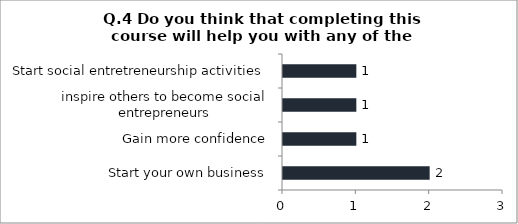
| Category | Q.4 Do you think that completing this course will help you with any of the followoing ? |
|---|---|
| Start your own business | 2 |
| Gain more confidence | 1 |
| inspire others to become social entrepreneurs | 1 |
| Start social entretreneurship activities | 1 |